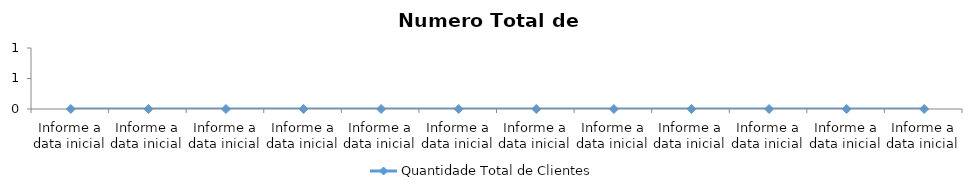
| Category | Quantidade Total de Clientes |
|---|---|
| Informe a data inicial | 0 |
| Informe a data inicial | 0 |
| Informe a data inicial | 0 |
| Informe a data inicial | 0 |
| Informe a data inicial | 0 |
| Informe a data inicial | 0 |
| Informe a data inicial | 0 |
| Informe a data inicial | 0 |
| Informe a data inicial | 0 |
| Informe a data inicial | 0 |
| Informe a data inicial | 0 |
| Informe a data inicial | 0 |